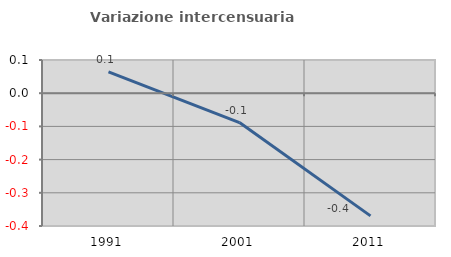
| Category | Variazione intercensuaria annua |
|---|---|
| 1991.0 | 0.064 |
| 2001.0 | -0.088 |
| 2011.0 | -0.37 |